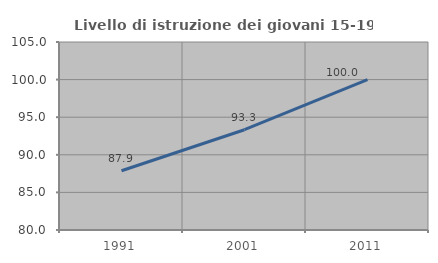
| Category | Livello di istruzione dei giovani 15-19 anni |
|---|---|
| 1991.0 | 87.879 |
| 2001.0 | 93.333 |
| 2011.0 | 100 |